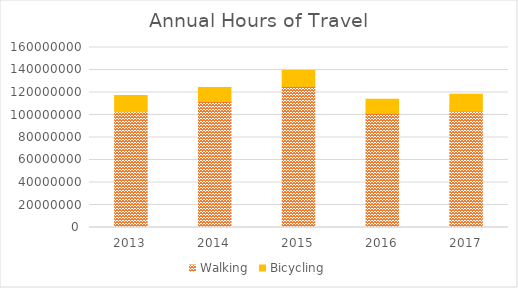
| Category | Walking | Bicycling |
|---|---|---|
| 2013 | 102794842.474 | 14477636.092 |
| 2014 | 112095369.755 | 12259521.645 |
| 2015 | 125525183.13 | 14006993.981 |
| 2016 | 101536460.825 | 12519396.927 |
| 2017 | 103395414.049 | 15133168.842 |